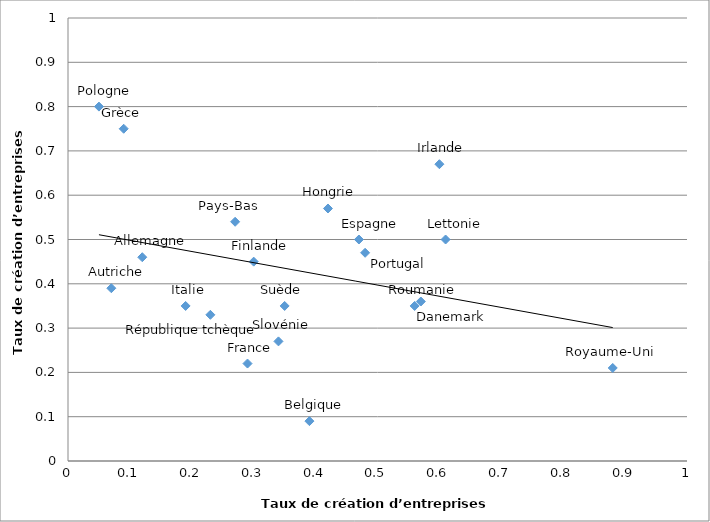
| Category | Series 0 |
|---|---|
| 0.05 | 0.8 |
| 0.09 | 0.75 |
| 0.6 | 0.67 |
| 0.42 | 0.57 |
| 0.27 | 0.54 |
| 0.61 | 0.5 |
| 0.47 | 0.5 |
| 0.48 | 0.47 |
| 0.12 | 0.46 |
| 0.3 | 0.45 |
| 0.07 | 0.39 |
| 0.57 | 0.36 |
| 0.56 | 0.35 |
| 0.19 | 0.35 |
| 0.35 | 0.35 |
| 0.23 | 0.33 |
| 0.34 | 0.27 |
| 0.29 | 0.22 |
| 0.88 | 0.21 |
| 0.39 | 0.09 |